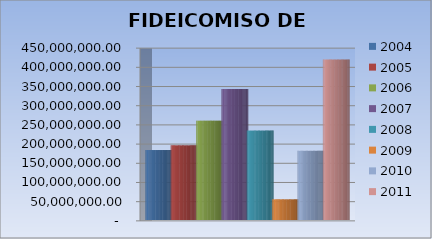
| Category | 2004 | 2005 | 2006 | 2007 | 2008 | 2009 | 2010 | 2011 |
|---|---|---|---|---|---|---|---|---|
| 0 | 182274750.83 | 194446021.27 | 258765065.87 | 341252274.86 | 232890391.03 | 53767953.75 | 180234345.93 | 417985069.81 |